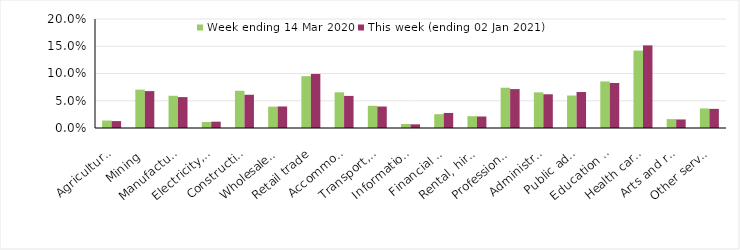
| Category | Week ending 14 Mar 2020 | This week (ending 02 Jan 2021) |
|---|---|---|
| Agriculture, forestry and fishing | 0.014 | 0.013 |
| Mining | 0.07 | 0.068 |
| Manufacturing | 0.059 | 0.057 |
| Electricity, gas, water and waste services | 0.011 | 0.012 |
| Construction | 0.068 | 0.061 |
| Wholesale trade | 0.039 | 0.04 |
| Retail trade | 0.095 | 0.099 |
| Accommodation and food services | 0.066 | 0.059 |
| Transport, postal and warehousing | 0.041 | 0.039 |
| Information media and telecommunications | 0.007 | 0.007 |
| Financial and insurance services | 0.025 | 0.028 |
| Rental, hiring and real estate services | 0.022 | 0.021 |
| Professional, scientific and technical services | 0.074 | 0.071 |
| Administrative and support services | 0.065 | 0.062 |
| Public administration and safety | 0.06 | 0.066 |
| Education and training | 0.085 | 0.083 |
| Health care and social assistance | 0.142 | 0.152 |
| Arts and recreation services | 0.016 | 0.016 |
| Other services | 0.036 | 0.035 |